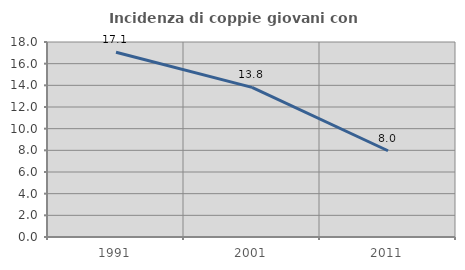
| Category | Incidenza di coppie giovani con figli |
|---|---|
| 1991.0 | 17.059 |
| 2001.0 | 13.81 |
| 2011.0 | 7.96 |